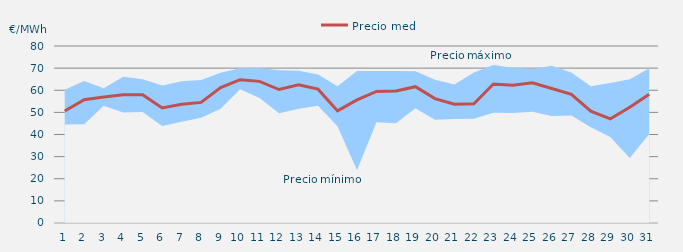
| Category | Precio medio |
|---|---|
| 1.0 | 50.644 |
| 2.0 | 55.743 |
| 3.0 | 56.914 |
| 4.0 | 57.932 |
| 5.0 | 57.981 |
| 6.0 | 51.98 |
| 7.0 | 53.695 |
| 8.0 | 54.516 |
| 9.0 | 61.179 |
| 10.0 | 64.755 |
| 11.0 | 64.018 |
| 12.0 | 60.331 |
| 13.0 | 62.416 |
| 14.0 | 60.498 |
| 15.0 | 50.671 |
| 16.0 | 55.654 |
| 17.0 | 59.459 |
| 18.0 | 59.666 |
| 19.0 | 61.597 |
| 20.0 | 56.213 |
| 21.0 | 53.725 |
| 22.0 | 53.882 |
| 23.0 | 62.798 |
| 24.0 | 62.316 |
| 25.0 | 63.393 |
| 26.0 | 60.763 |
| 27.0 | 58.174 |
| 28.0 | 50.541 |
| 29.0 | 47.108 |
| 30.0 | 52.297 |
| 31.0 | 58.152 |